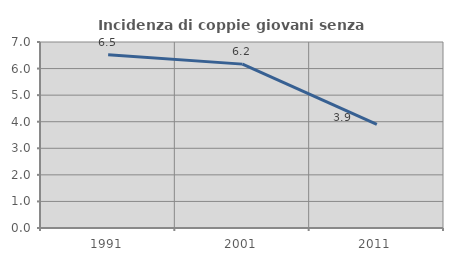
| Category | Incidenza di coppie giovani senza figli |
|---|---|
| 1991.0 | 6.522 |
| 2001.0 | 6.167 |
| 2011.0 | 3.896 |